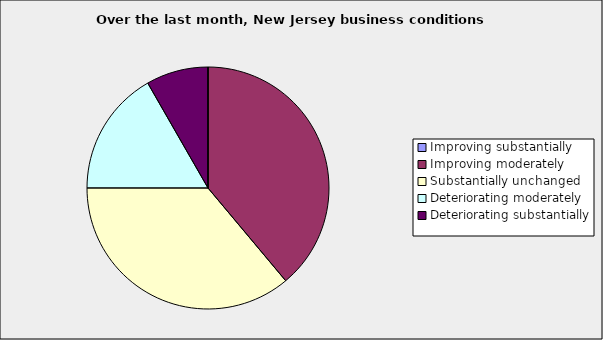
| Category | Series 0 |
|---|---|
| Improving substantially | 0 |
| Improving moderately | 0.389 |
| Substantially unchanged | 0.361 |
| Deteriorating moderately | 0.167 |
| Deteriorating substantially | 0.083 |